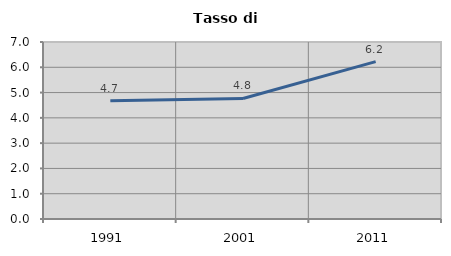
| Category | Tasso di disoccupazione   |
|---|---|
| 1991.0 | 4.676 |
| 2001.0 | 4.767 |
| 2011.0 | 6.224 |